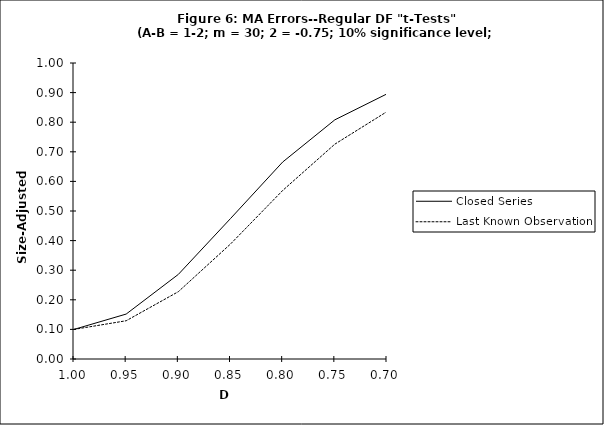
| Category | Closed Series | Last Known Observation |
|---|---|---|
| 1.0 | 0.1 | 0.1 |
| 0.95 | 0.152 | 0.129 |
| 0.9 | 0.286 | 0.227 |
| 0.85 | 0.474 | 0.388 |
| 0.8 | 0.665 | 0.569 |
| 0.75 | 0.808 | 0.726 |
| 0.7 | 0.896 | 0.836 |